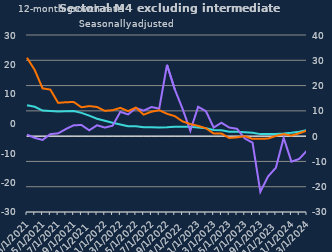
| Category | zero | Households | Non-intermediate OFCs |
|---|---|---|---|
| Mar-2021 | 0 | 12.2 | 0.6 |
| Apr-2021 | 0 | 11.6 | -0.7 |
| May-2021 | 0 | 10.1 | -1.5 |
| Jun-2021 | 0 | 9.9 | 0.8 |
| Jul-2021 | 0 | 9.7 | 1.1 |
| Aug-2021 | 0 | 9.8 | 2.8 |
| Sep-2021 | 0 | 9.9 | 4.3 |
| Oct-2021 | 0 | 9.2 | 4.4 |
| Nov-2021 | 0 | 8.1 | 2.3 |
| Dec-2021 | 0 | 6.9 | 4.3 |
| Jan-2022 | 0 | 6.1 | 3.4 |
| Feb-2022 | 0 | 5.3 | 4.1 |
| Mar-2022 | 0 | 4.6 | 9.6 |
| Apr-2022 | 0 | 3.9 | 8.6 |
| May-2022 | 0 | 3.9 | 11.1 |
| Jun-2022 | 0 | 3.5 | 10.1 |
| Jul-2022 | 0 | 3.5 | 11.5 |
| Aug-2022 | 0 | 3.4 | 10.9 |
| Sep-2022 | 0 | 3.5 | 28.2 |
| Oct-2022 | 0 | 3.7 | 18.5 |
| Nov-2022 | 0 | 3.7 | 10.8 |
| Dec-2022 | 0 | 3.7 | 2.1 |
| Jan-2023 | 0 | 3.4 | 11.6 |
| Feb-2023 | 0 | 3.1 | 9.9 |
| Mar-2023 | 0 | 2.4 | 3.4 |
| Apr-2023 | 0 | 2.3 | 5.3 |
| May-2023 | 0 | 1.7 | 3.4 |
| Jun-2023 | 0 | 1.7 | 2.9 |
| Jul-2023 | 0 | 1.5 | -0.9 |
| Aug-2023 | 0 | 1.3 | -2.6 |
| Sep-2023 | 0 | 0.8 | -22 |
| Oct-2023 | 0 | 0.8 | -15.9 |
| Nov-2023 | 0 | 0.8 | -12.5 |
| Dec-2023 | 0 | 1 | -0.7 |
| Jan-2024 | 0 | 1.3 | -10.1 |
| Feb-2024 | 0 | 1.7 | -9 |
| Mar-2024 | 0 | 2.4 | -5.7 |